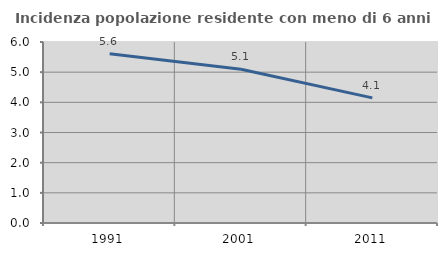
| Category | Incidenza popolazione residente con meno di 6 anni |
|---|---|
| 1991.0 | 5.609 |
| 2001.0 | 5.095 |
| 2011.0 | 4.148 |